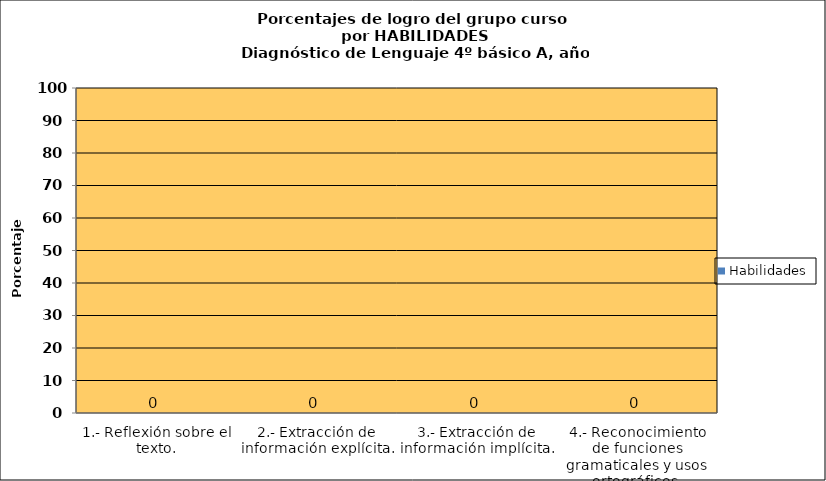
| Category | Habilidades |
|---|---|
| 1.- Reflexión sobre el texto. | 0 |
| 2.- Extracción de información explícita. | 0 |
| 3.- Extracción de información implícita. | 0 |
| 4.- Reconocimiento de funciones gramaticales y usos ortográficos. | 0 |